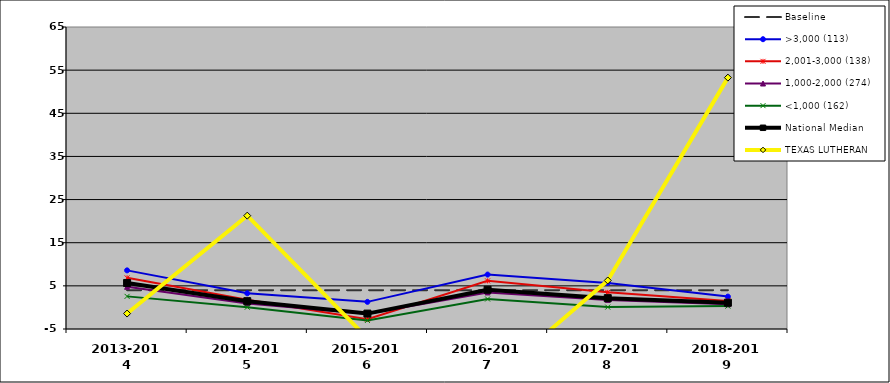
| Category | Baseline | >3,000 (113) | 2,001-3,000 (138) | 1,000-2,000 (274) | <1,000 (162) | National Median | TEXAS LUTHERAN |
|---|---|---|---|---|---|---|---|
| 2013-2014 | 4 | 8.592 | 6.857 | 4.774 | 2.562 | 5.667 | -1.419 |
| 2014-2015 | 4 | 3.277 | 1.779 | 0.928 | 0.05 | 1.445 | 21.272 |
| 2015-2016 | 4 | 1.291 | -2.72 | -1.441 | -3.016 | -1.431 | -7.157 |
| 2016-2017 | 4 | 7.619 | 6.155 | 3.471 | 1.951 | 4.105 | -17.719 |
| 2017-2018 | 4 | 5.673 | 3.498 | 1.747 | 0.077 | 2.148 | 6.249 |
| 2018-2019 | 4 | 2.507 | 1.496 | 0.712 | 0.302 | 1.087 | 53.269 |